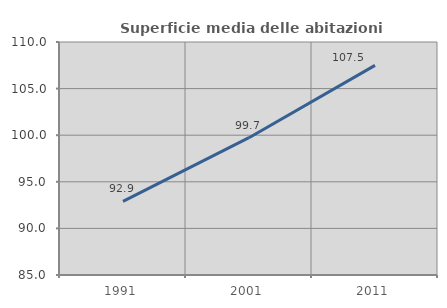
| Category | Superficie media delle abitazioni occupate |
|---|---|
| 1991.0 | 92.904 |
| 2001.0 | 99.732 |
| 2011.0 | 107.489 |